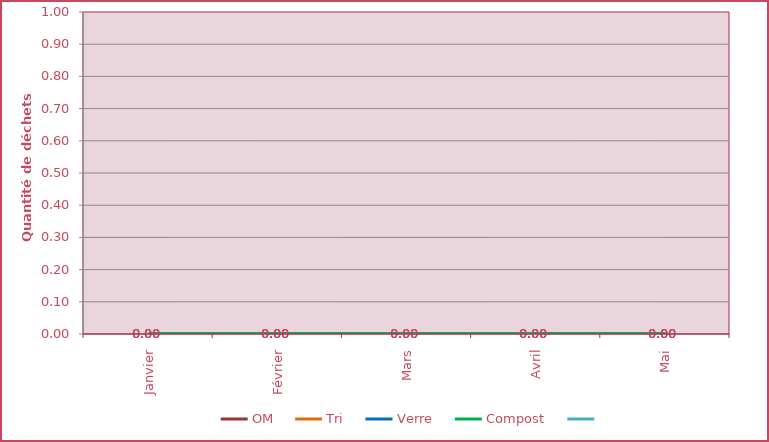
| Category | OM | Tri | Verre | Compost | Series 4 |
|---|---|---|---|---|---|
| Janvier | 0 | 0 | 0 | 0 |  |
| Février | 0 | 0 | 0 | 0 |  |
| Mars | 0 | 0 | 0 | 0 |  |
| Avril | 0 | 0 | 0 | 0 |  |
| Mai | 0 | 0 | 0 | 0 |  |